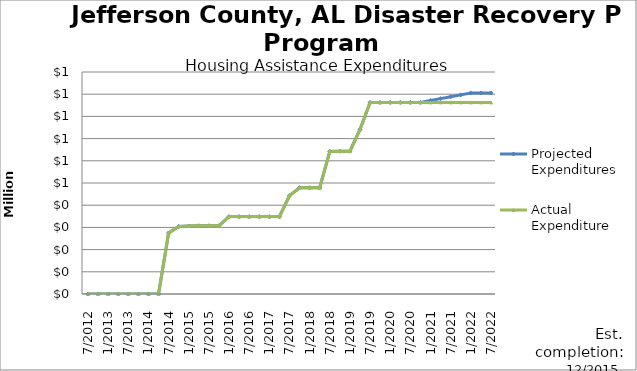
| Category | Projected Expenditures | Actual Expenditure |
|---|---|---|
| 7/2012 | 0 | 0 |
| 10/2012 | 0 | 0 |
| 1/2013 | 0 | 0 |
| 4/2013 | 0 | 0 |
| 7/2013 | 0 | 0 |
| 10/2013 | 0 | 0 |
| 1/2014 | 0 | 0 |
| 4/2014 | 0 | 0 |
| 7/2014 | 275002 | 275002.32 |
| 10/2014 | 304043 | 304043.69 |
| 1/2015 | 306243 | 306243.69 |
| 4/2015 | 307343 | 307343.69 |
| 7/2015 | 307343 | 307343.69 |
| 10/2015 | 307343 | 307343.69 |
| 1/2016 | 348743 | 348743.69 |
| 4/2016 | 348743 | 348743.69 |
| 7/2016 | 348743 | 348743.69 |
| 10/2016 | 348743 | 348743.69 |
| 1/2017 | 348743 | 348743.69 |
| 4/2017 | 348743 | 348743.69 |
| 7/2017 | 443000 | 443000.69 |
| 10/2017 | 478783 | 478783.71 |
| 1/2018 | 478783 | 478783.71 |
| 4/2018 | 478783 | 478783.71 |
| 7/2018 | 642113.89 | 642114.6 |
| 10/2018 | 643525.64 | 643526.35 |
| 1/2019 | 643525.64 | 643526.35 |
| 4/2019 | 741216.43 | 741217.14 |
| 7/2019 | 862966.43 | 862967.14 |
| 10/2019 | 862966.43 | 862967.14 |
| 1/2020 | 862966.43 | 862967.14 |
| 4/2020 | 862966.43 | 862967.14 |
| 7/2020 | 862966.43 | 862967.14 |
| 10/2020 | 862966.43 | 862967.14 |
| 1/2021 | 871467.83 | 862967.14 |
| 4/2021 | 879969.23 | 862967.14 |
| 7/2021 | 888470.63 | 862967.14 |
| 10/2021 | 896972.03 | 862967.14 |
| 1/2022 | 905473.43 | 862967.14 |
| 4/2022 | 905473.43 | 862967.14 |
| 7/2022 | 905473.43 | 862967.14 |